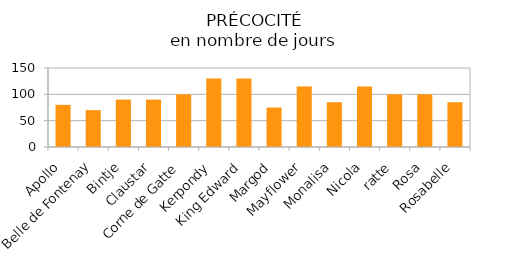
| Category | précocité (jours) |
|---|---|
| Apollo | 80 |
| Belle de Fontenay | 70 |
| Bintje | 90 |
| Claustar | 90 |
| Corne de Gatte | 100 |
| Kerpondy | 130 |
| King Edward | 130 |
| Margod  | 75 |
| Mayflower  | 115 |
| Monalisa | 85 |
| Nicola | 115 |
| ratte | 100 |
| Rosa | 100 |
| Rosabelle | 85 |